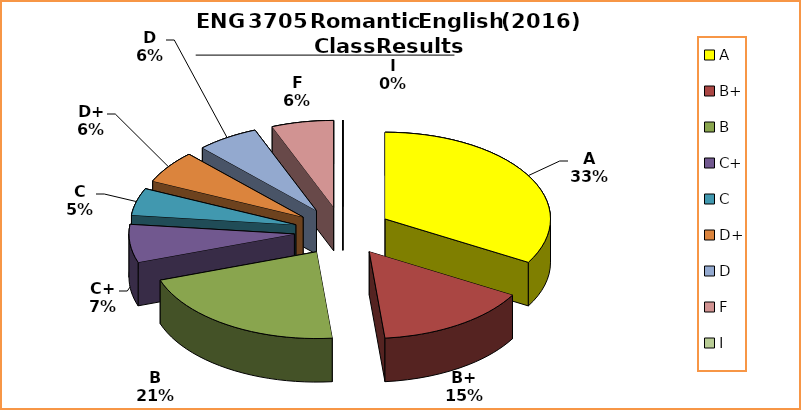
| Category | Series 0 |
|---|---|
| A | 33 |
| B+ | 15 |
| B | 21 |
| C+ | 7 |
| C | 5 |
| D+ | 6 |
| D | 6 |
| F | 6 |
| I | 0 |